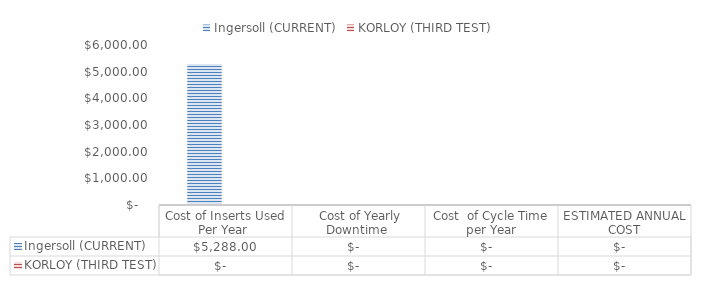
| Category | Ingersoll (CURRENT) | KORLOY (THIRD TEST) |
|---|---|---|
| Cost of Inserts Used Per Year  | 5288 | 0 |
|  Cost of Yearly Downtime  | 0 | 0 |
| Cost  of Cycle Time per Year | 0 | 0 |
| ESTIMATED ANNUAL COST | 0 | 0 |